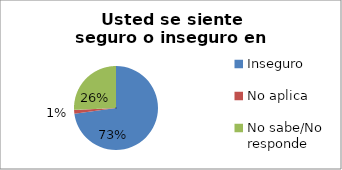
| Category | Series 0 |
|---|---|
| Inseguro | 0.6 |
| No aplica | 0.012 |
| No sabe/No responde | 0.212 |